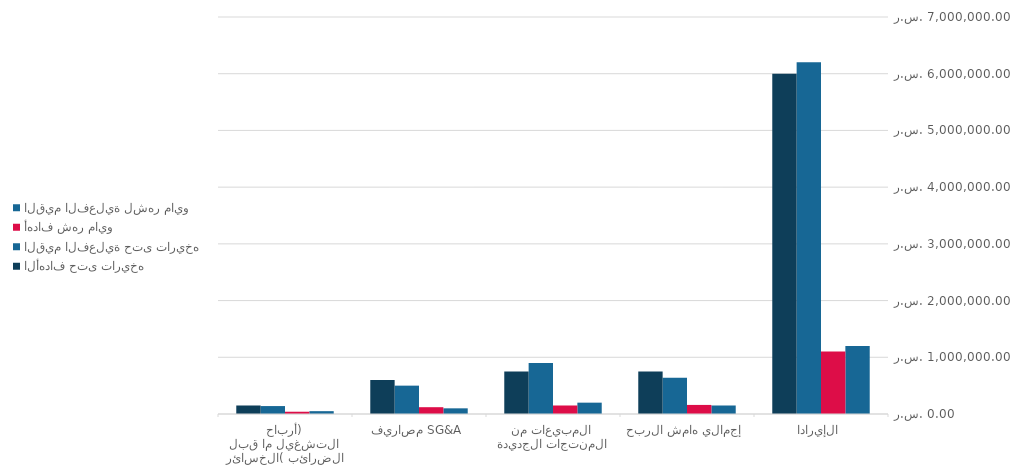
| Category | القيم الفعلية لشهر مايو | أهداف شهر مايو | القيم الفعلية حتى تاريخه | الأهداف حتى تاريخه |
|---|---|---|---|---|
| الإيرادات | 1200000 | 1100000 | 6200000 | 6000000 |
| إجمالي هامش الربح | 150000 | 160000 | 640000 | 750000 |
| المبيعات من المنتجات الجديدة | 200000 | 150000 | 900000 | 750000 |
| مصاريف SG&A | 100000 | 120000 | 500000 | 600000 |
| أرباح التشغيل ما قبل الضرائب (الخسائر) | 50000 | 40000 | 140000 | 150000 |